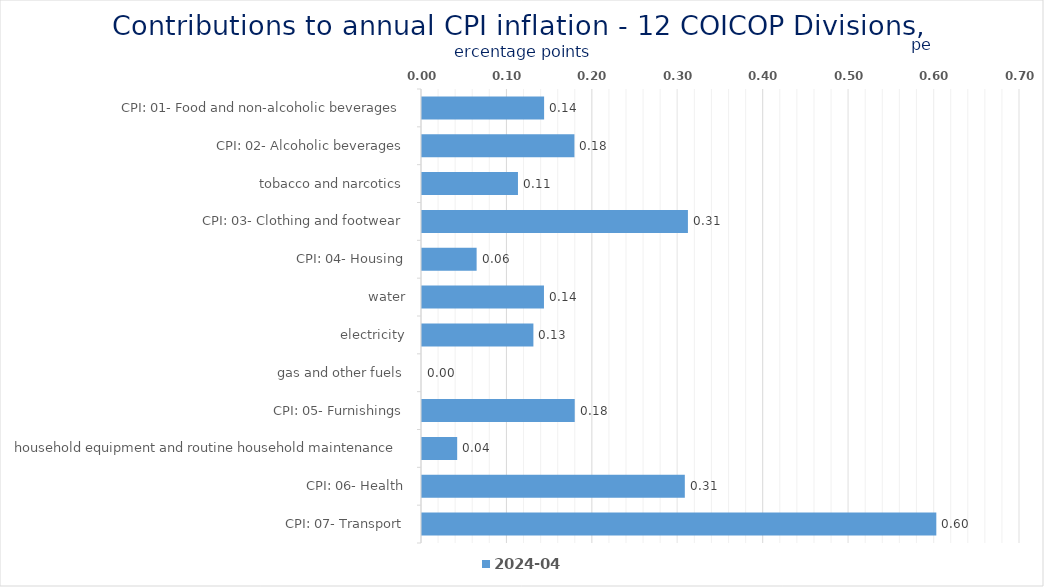
| Category | 2024-04 |
|---|---|
| CPI: 01- Food and non-alcoholic beverages | 0.143 |
| CPI: 02- Alcoholic beverages, tobacco and narcotics | 0.178 |
| CPI: 03- Clothing and footwear | 0.112 |
| CPI: 04- Housing, water, electricity, gas and other fuels | 0.311 |
| CPI: 05- Furnishings, household equipment and routine household maintenance | 0.064 |
| CPI: 06- Health | 0.143 |
| CPI: 07- Transport | 0.13 |
| CPI: 08- Communication | 0 |
| CPI: 09- Recreation and culture | 0.179 |
| CPI: 10- Education | 0.041 |
| CPI: 11- Restaurants and hotels | 0.308 |
| CPI: 12- Miscellaneous goods and services | 0.602 |